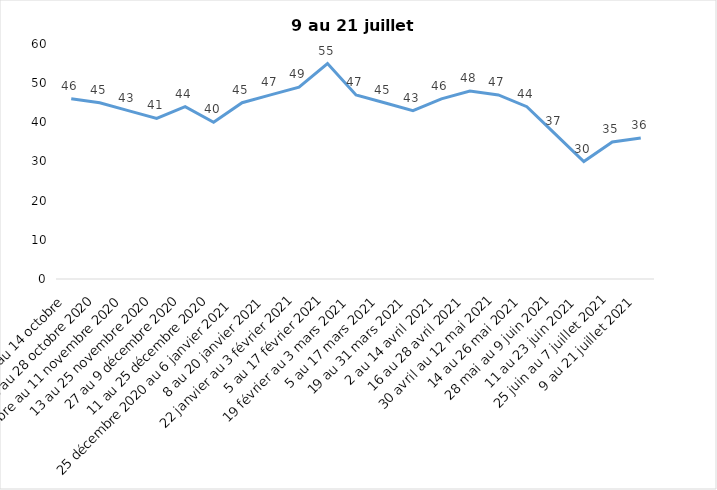
| Category | Toujours aux trois mesures |
|---|---|
| 2 au 14 octobre  | 46 |
| 16 au 28 octobre 2020 | 45 |
| 30 octobre au 11 novembre 2020 | 43 |
| 13 au 25 novembre 2020 | 41 |
| 27 au 9 décembre 2020 | 44 |
| 11 au 25 décembre 2020 | 40 |
| 25 décembre 2020 au 6 janvier 2021 | 45 |
| 8 au 20 janvier 2021 | 47 |
| 22 janvier au 3 février 2021 | 49 |
| 5 au 17 février 2021 | 55 |
| 19 février au 3 mars 2021 | 47 |
| 5 au 17 mars 2021 | 45 |
| 19 au 31 mars 2021 | 43 |
| 2 au 14 avril 2021 | 46 |
| 16 au 28 avril 2021 | 48 |
| 30 avril au 12 mai 2021 | 47 |
| 14 au 26 mai 2021 | 44 |
| 28 mai au 9 juin 2021 | 37 |
| 11 au 23 juin 2021 | 30 |
| 25 juin au 7 juillet 2021 | 35 |
| 9 au 21 juillet 2021 | 36 |